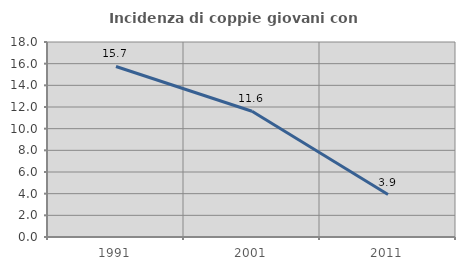
| Category | Incidenza di coppie giovani con figli |
|---|---|
| 1991.0 | 15.741 |
| 2001.0 | 11.607 |
| 2011.0 | 3.922 |